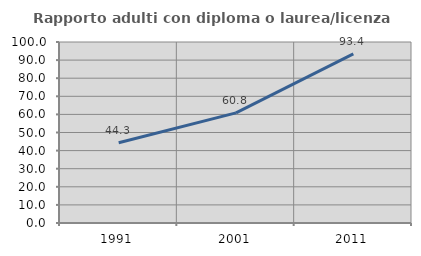
| Category | Rapporto adulti con diploma o laurea/licenza media  |
|---|---|
| 1991.0 | 44.335 |
| 2001.0 | 60.839 |
| 2011.0 | 93.438 |